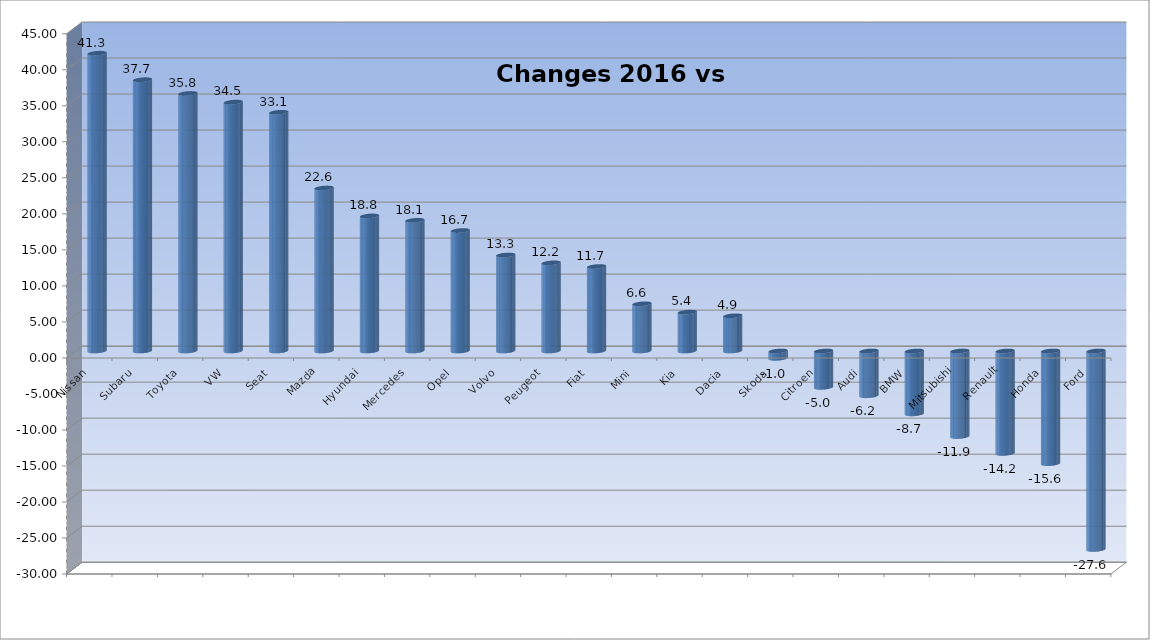
| Category | Ytd 2015 |
|---|---|
| Nissan | 41.34 |
| Subaru | 37.666 |
| Toyota | 35.752 |
| VW | 34.549 |
| Seat | 33.143 |
| Mazda | 22.633 |
| Hyundai | 18.75 |
| Mercedes | 18.144 |
| Opel | 16.722 |
| Volvo | 13.327 |
| Peugeot | 12.239 |
| Fiat | 11.726 |
| Mini | 6.552 |
| Kia | 5.395 |
| Dacia | 4.893 |
| Skoda | -1.02 |
| Citroen | -5.046 |
| Audi | -6.216 |
| BMW | -8.729 |
| Mitsubishi | -11.877 |
| Renault | -14.224 |
| Honda | -15.636 |
| Ford | -27.553 |